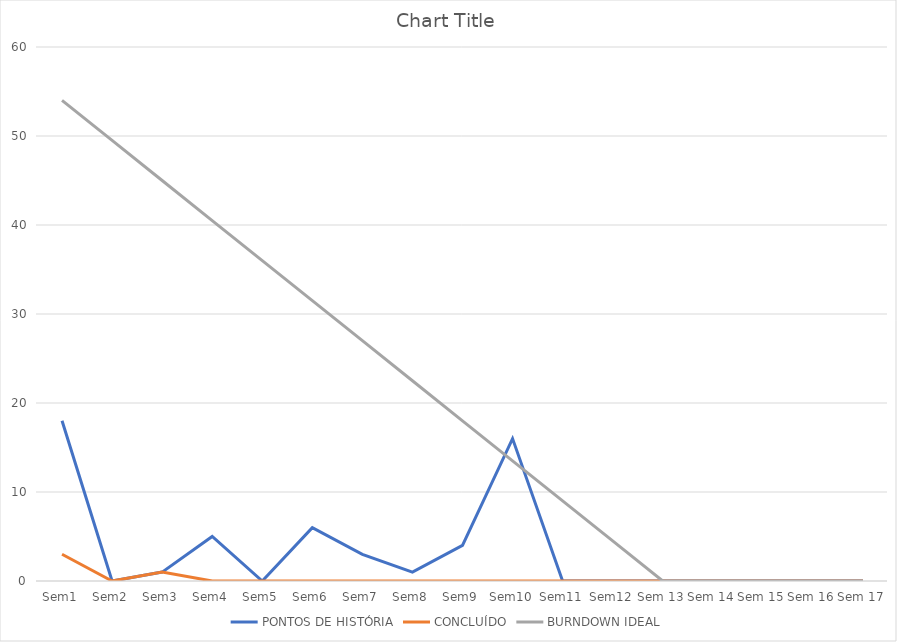
| Category | PONTOS DE HISTÓRIA | CONCLUÍDO | BURNDOWN IDEAL |
|---|---|---|---|
| Sem1 | 18 | 3 | 54 |
| Sem2 | 0 | 0 | 49.5 |
| Sem3 | 1 | 1 | 45 |
| Sem4 | 5 | 0 | 40.5 |
| Sem5 | 0 | 0 | 36 |
| Sem6 | 6 | 0 | 31.5 |
| Sem7 | 3 | 0 | 27 |
| Sem8 | 1 | 0 | 22.5 |
| Sem9 | 4 | 0 | 18 |
| Sem10 | 16 | 0 | 13.5 |
| Sem11 | 0 | 0 | 9 |
| Sem12 | 0 | 0 | 4.5 |
| Sem 13 | 0 | 0 | 0 |
| Sem 14 | 0 | 0 | 0 |
| Sem 15 | 0 | 0 | 0 |
| Sem 16 | 0 | 0 | 0 |
| Sem 17 | 0 | 0 | 0 |